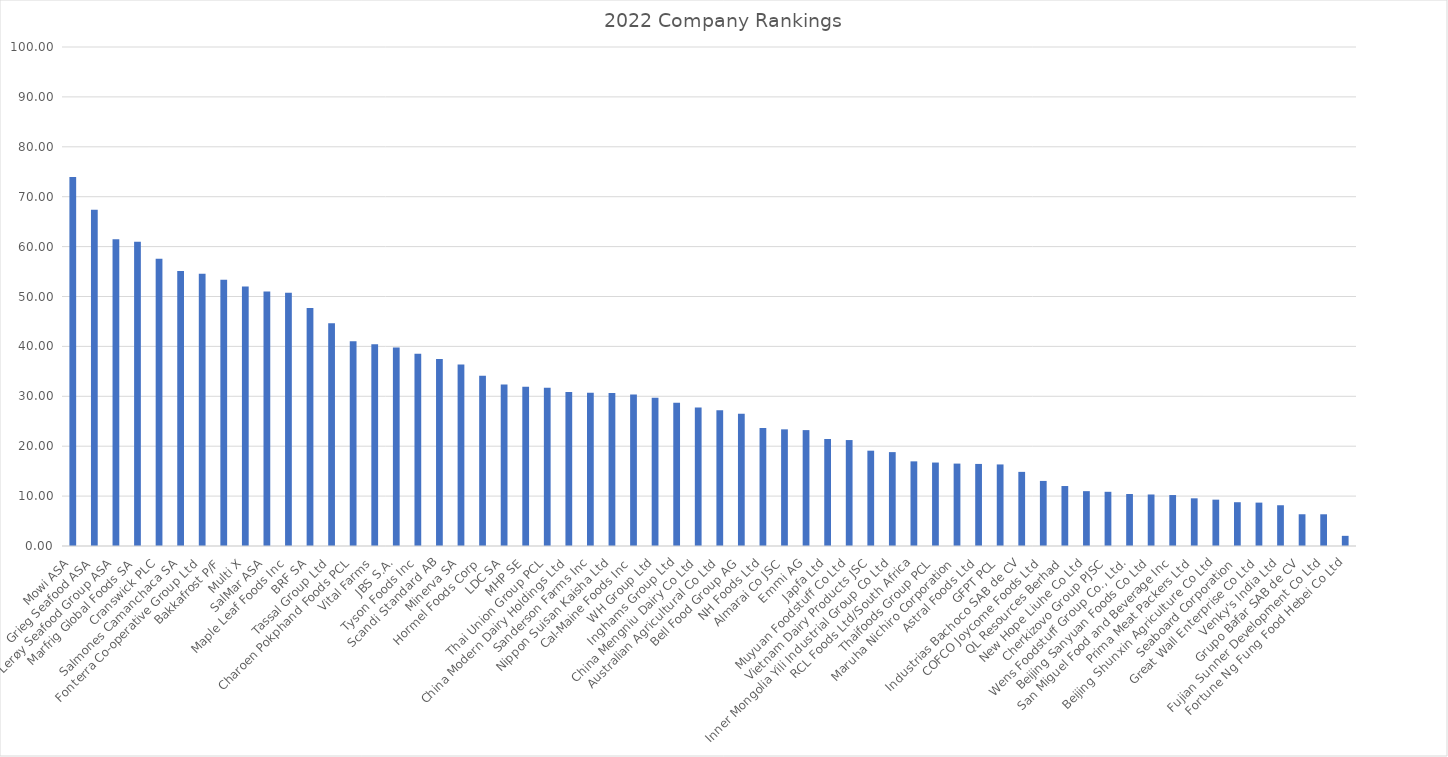
| Category | 73.95 |
|---|---|
| Mowi ASA | 73.948 |
| Grieg Seafood ASA | 67.366 |
| Lerøy Seafood Group ASA | 61.49 |
| Marfrig Global Foods SA | 60.963 |
| Cranswick PLC | 57.566 |
| Salmones Camanchaca SA | 55.094 |
| Fonterra Co-operative Group Ltd | 54.539 |
| Bakkafrost P/F | 53.337 |
| Multi X | 51.981 |
| SalMar ASA | 50.989 |
| Maple Leaf Foods Inc | 50.764 |
| BRF SA | 47.689 |
| Tassal Group Ltd | 44.619 |
| Charoen Pokphand Foods PCL | 41.036 |
| Vital Farms | 40.411 |
| JBS S.A. | 39.76 |
| Tyson Foods Inc | 38.533 |
| Scandi Standard AB | 37.485 |
| Minerva SA | 36.393 |
| Hormel Foods Corp | 34.131 |
| LDC SA | 32.35 |
| MHP SE | 31.922 |
| Thai Union Group PCL | 31.703 |
| China Modern Dairy Holdings Ltd | 30.852 |
| Sanderson Farms Inc | 30.704 |
| Nippon Suisan Kaisha Ltd | 30.637 |
| Cal-Maine Foods Inc | 30.369 |
| WH Group Ltd | 29.693 |
| Inghams Group Ltd | 28.713 |
| China Mengniu Dairy Co Ltd | 27.758 |
| Australian Agricultural Co Ltd | 27.2 |
| Bell Food Group AG | 26.523 |
| NH Foods Ltd | 23.65 |
| Almarai Co JSC | 23.378 |
| Emmi AG | 23.225 |
| Japfa Ltd | 21.445 |
| Muyuan Foodstuff Co Ltd | 21.231 |
| Vietnam Dairy Products JSC | 19.102 |
| Inner Mongolia Yili Industrial Group Co Ltd | 18.815 |
| RCL Foods Ltd/South Africa | 16.963 |
| Thaifoods Group PCL | 16.724 |
| Maruha Nichiro Corporation | 16.516 |
| Astral Foods Ltd | 16.446 |
| GFPT PCL | 16.345 |
| Industrias Bachoco SAB de CV | 14.856 |
| COFCO Joycome Foods Ltd | 13.042 |
| QL Resources Berhad | 12.019 |
| New Hope Liuhe Co Ltd | 10.991 |
| Cherkizovo Group PJSC | 10.861 |
| Wens Foodstuff Group Co., Ltd. | 10.417 |
| Beijing Sanyuan Foods Co Ltd | 10.324 |
| San Miguel Food and Beverage Inc | 10.213 |
| Prima Meat Packers Ltd | 9.556 |
| Beijing Shunxin Agriculture Co Ltd | 9.287 |
| Seaboard Corporation | 8.773 |
| Great Wall Enterprise Co Ltd | 8.695 |
| Venky's India Ltd | 8.167 |
| Grupo Bafar SAB de CV | 6.362 |
| Fujian Sunner Development Co Ltd | 6.357 |
| Fortune Ng Fung Food Hebei Co Ltd | 2.037 |